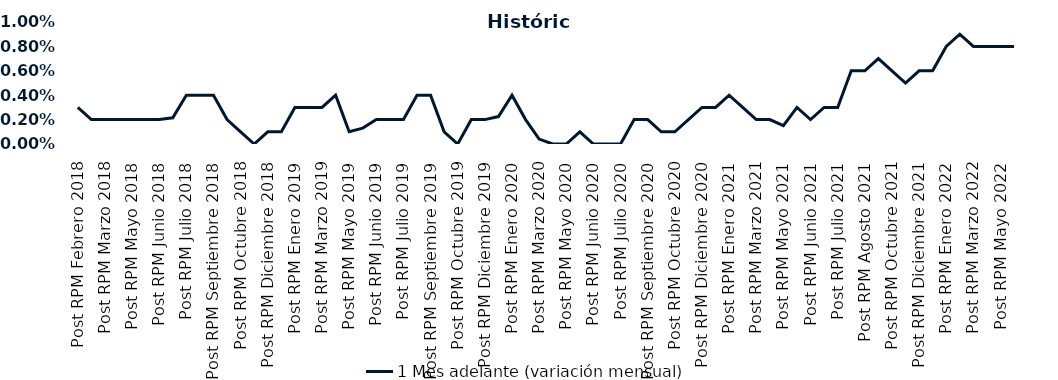
| Category | 1 Mes adelante (variación mensual) |
|---|---|
| Post RPM Febrero 2018 | 0.003 |
| Pre RPM Marzo 2018 | 0.002 |
| Post RPM Marzo 2018 | 0.002 |
| Pre RPM Mayo 2018 | 0.002 |
| Post RPM Mayo 2018 | 0.002 |
| Pre RPM Junio 2018 | 0.002 |
| Post RPM Junio 2018 | 0.002 |
| Pre RPM Julio 2018 | 0.002 |
| Post RPM Julio 2018 | 0.004 |
| Pre RPM Septiembre 2018 | 0.004 |
| Post RPM Septiembre 2018 | 0.004 |
| Pre RPM Octubre 2018 | 0.002 |
| Post RPM Octubre 2018 | 0.001 |
| Pre RPM Diciembre 2018 | 0 |
| Post RPM Diciembre 2018 | 0.001 |
| Pre RPM Enero 2019 | 0.001 |
| Post RPM Enero 2019 | 0.003 |
| Pre RPM Marzo 2019 | 0.003 |
| Post RPM Marzo 2019 | 0.003 |
| Pre RPM Mayo 2019 | 0.004 |
| Post RPM Mayo 2019 | 0.001 |
| Pre RPM Junio 2019 | 0.001 |
| Post RPM Junio 2019 | 0.002 |
| Pre RPM Julio 2019 | 0.002 |
| Post RPM Julio 2019 | 0.002 |
| Pre RPM Septiembre 2019 | 0.004 |
| Post RPM Septiembre 2019 | 0.004 |
| Pre RPM Octubre 2019 | 0.001 |
| Post RPM Octubre 2019 | 0 |
| Pre RPM Diciembre 2019 | 0.002 |
| Post RPM Diciembre 2019 | 0.002 |
| Pre RPM Enero 2020 | 0.002 |
| Post RPM Enero 2020 | 0.004 |
| Pre RPM Marzo 2020 | 0.002 |
| Post RPM Marzo 2020 | 0 |
| Pre RPM Mayo 2020 | 0 |
| Post RPM Mayo 2020 | 0 |
| Pre RPM Junio 2020 | 0.001 |
| Post RPM Junio 2020 | 0 |
| Pre RPM Julio 2020 | 0 |
| Post RPM Julio 2020 | 0 |
| Pre RPM Septiembre 2020 | 0.002 |
| Post RPM Septiembre 2020 | 0.002 |
| Pre RPM Octubre 2020 | 0.001 |
| Post RPM Octubre 2020 | 0.001 |
| Pre RPM Diciembre 2020 | 0.002 |
| Post RPM Diciembre 2020 | 0.003 |
| Pre RPM Enero 2021 | 0.003 |
| Post RPM Enero 2021 | 0.004 |
| Pre RPM Marzo 2021 | 0.003 |
| Post RPM Marzo 2021 | 0.002 |
| Pre RPM Mayo 2021 | 0.002 |
| Post RPM Mayo 2021 | 0.002 |
| Pre RPM Junio 2021 | 0.003 |
| Post RPM Junio 2021 | 0.002 |
| Pre RPM Julio 2021 | 0.003 |
| Post RPM Julio 2021 | 0.003 |
| Pre RPM Agosto 2021 | 0.006 |
| Post RPM Agosto 2021 | 0.006 |
| Pre RPM Octubre 2021 | 0.007 |
| Post RPM Octubre 2021 | 0.006 |
| Pre RPM Diciembre 2021 | 0.005 |
| Post RPM Diciembre 2021 | 0.006 |
| Pre RPM Enero 2022 | 0.006 |
| Post RPM Enero 2022 | 0.008 |
| Pre RPM Marzo 2022 | 0.009 |
| Post RPM Marzo 2022 | 0.008 |
| Pre RPM Mayo 2022 | 0.008 |
| Post RPM Mayo 2022 | 0.008 |
| Pre RPM Junio 2022 | 0.008 |